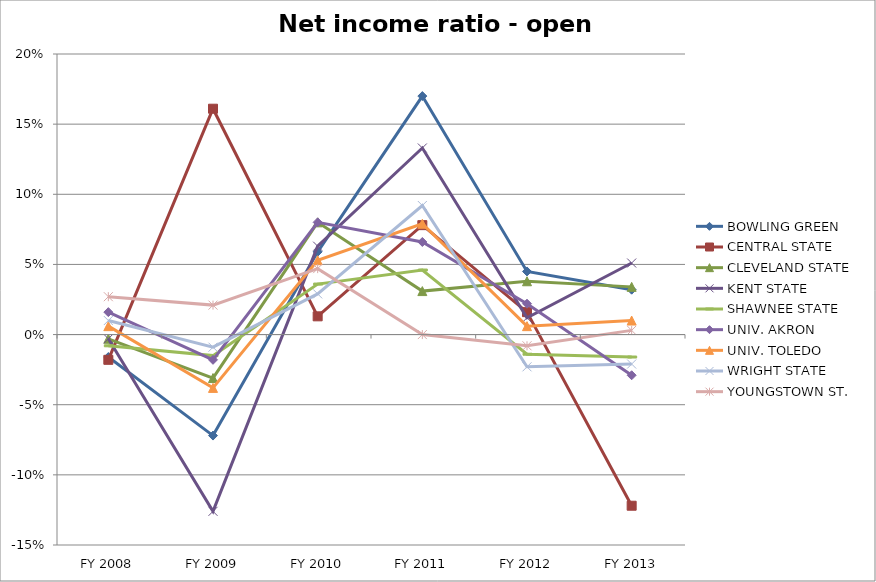
| Category | BOWLING GREEN  | CENTRAL STATE  | CLEVELAND STATE  | KENT STATE  | SHAWNEE STATE  | UNIV. AKRON  | UNIV. TOLEDO  | WRIGHT STATE  | YOUNGSTOWN ST.  |
|---|---|---|---|---|---|---|---|---|---|
| FY 2013 | 0.032 | -0.122 | 0.034 | 0.051 | -0.016 | -0.029 | 0.01 | -0.021 | 0.003 |
| FY 2012 | 0.045 | 0.016 | 0.038 | 0.012 | -0.014 | 0.022 | 0.006 | -0.023 | -0.008 |
| FY 2011 | 0.17 | 0.078 | 0.031 | 0.133 | 0.046 | 0.066 | 0.079 | 0.092 | 0 |
| FY 2010 | 0.059 | 0.013 | 0.08 | 0.063 | 0.036 | 0.08 | 0.053 | 0.029 | 0.047 |
| FY 2009 | -0.072 | 0.161 | -0.031 | -0.126 | -0.015 | -0.018 | -0.038 | -0.009 | 0.021 |
| FY 2008 | -0.016 | -0.018 | -0.003 | -0.003 | -0.008 | 0.016 | 0.006 | 0.01 | 0.027 |